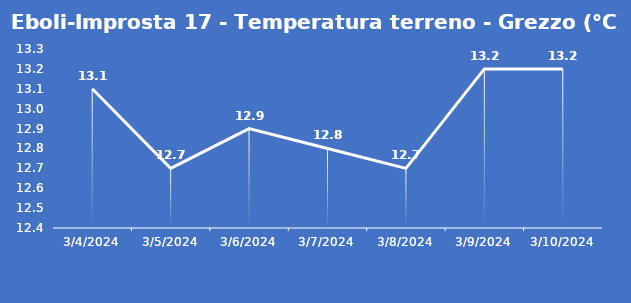
| Category | Eboli-Improsta 17 - Temperatura terreno - Grezzo (°C) |
|---|---|
| 3/4/24 | 13.1 |
| 3/5/24 | 12.7 |
| 3/6/24 | 12.9 |
| 3/7/24 | 12.8 |
| 3/8/24 | 12.7 |
| 3/9/24 | 13.2 |
| 3/10/24 | 13.2 |